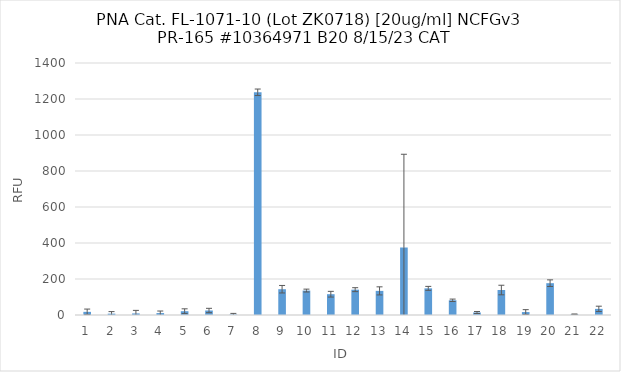
| Category | RFU |
|---|---|
| 0 | 17.5 |
| 1 | 7.5 |
| 2 | 8.75 |
| 3 | 10.75 |
| 4 | 21 |
| 5 | 25 |
| 6 | 2.75 |
| 7 | 1237.25 |
| 8 | 143.25 |
| 9 | 135.75 |
| 10 | 115.5 |
| 11 | 140.75 |
| 12 | 134 |
| 13 | 375 |
| 14 | 148 |
| 15 | 81.75 |
| 16 | 14 |
| 17 | 138.75 |
| 18 | 16.25 |
| 19 | 176.75 |
| 20 | 4.25 |
| 21 | 34 |